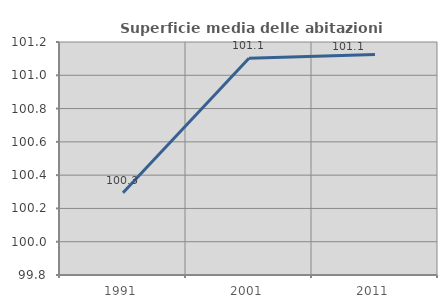
| Category | Superficie media delle abitazioni occupate |
|---|---|
| 1991.0 | 100.294 |
| 2001.0 | 101.102 |
| 2011.0 | 101.124 |